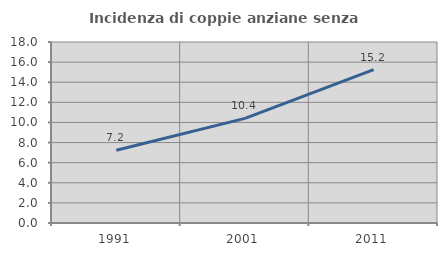
| Category | Incidenza di coppie anziane senza figli  |
|---|---|
| 1991.0 | 7.228 |
| 2001.0 | 10.404 |
| 2011.0 | 15.244 |